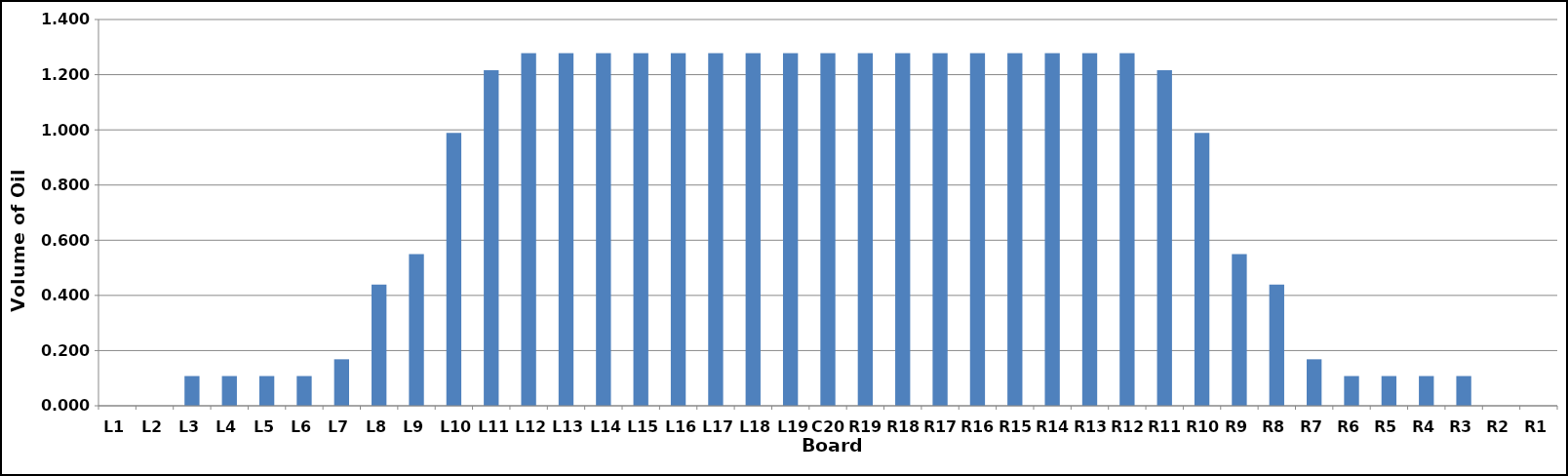
| Category | Series 0 |
|---|---|
| L1 | 0 |
| L2 | 0 |
| L3 | 0.108 |
| L4 | 0.108 |
| L5 | 0.108 |
| L6 | 0.108 |
| L7 | 0.169 |
| L8 | 0.44 |
| L9 | 0.55 |
| L10 | 0.989 |
| L11 | 1.216 |
| L12 | 1.278 |
| L13 | 1.278 |
| L14 | 1.278 |
| L15 | 1.278 |
| L16 | 1.278 |
| L17 | 1.278 |
| L18 | 1.278 |
| L19 | 1.278 |
| C20 | 1.278 |
| R19 | 1.278 |
| R18 | 1.278 |
| R17 | 1.278 |
| R16 | 1.278 |
| R15 | 1.278 |
| R14 | 1.278 |
| R13 | 1.278 |
| R12 | 1.278 |
| R11 | 1.216 |
| R10 | 0.989 |
| R9 | 0.55 |
| R8 | 0.44 |
| R7 | 0.169 |
| R6 | 0.108 |
| R5 | 0.108 |
| R4 | 0.108 |
| R3 | 0.108 |
| R2 | 0 |
| R1 | 0 |